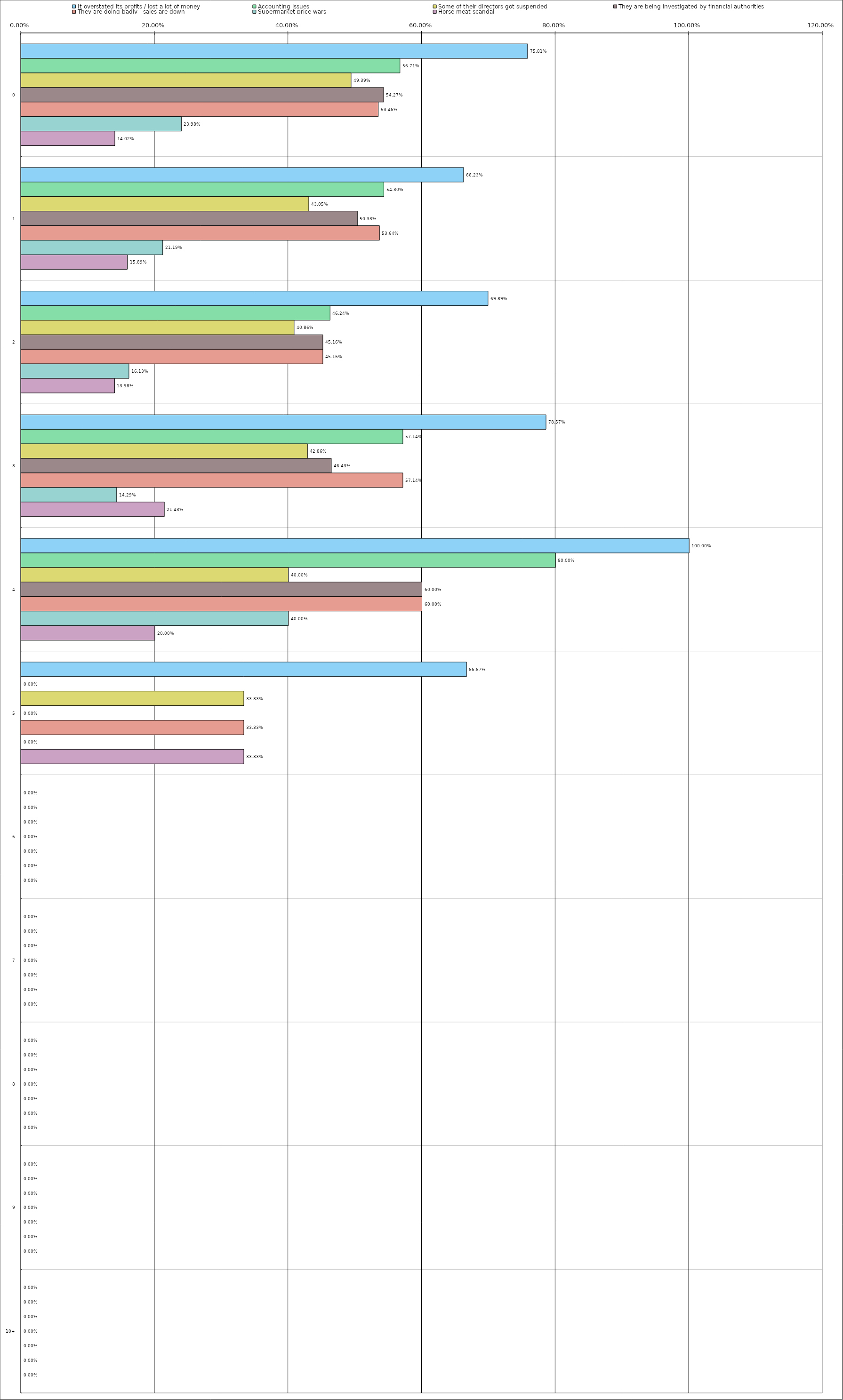
| Category | It overstated its profits / lost a lot of money | Accounting issues | Some of their directors got suspended | They are being investigated by financial authorities | They are doing badly - sales are down | Supermarket price wars | Horse-meat scandal |
|---|---|---|---|---|---|---|---|
| 0 | 0.758 | 0.567 | 0.494 | 0.543 | 0.535 | 0.24 | 0.14 |
| 1 | 0.662 | 0.543 | 0.43 | 0.503 | 0.536 | 0.212 | 0.159 |
| 2 | 0.699 | 0.462 | 0.409 | 0.452 | 0.452 | 0.161 | 0.14 |
| 3 | 0.786 | 0.571 | 0.429 | 0.464 | 0.571 | 0.143 | 0.214 |
| 4 | 1 | 0.8 | 0.4 | 0.6 | 0.6 | 0.4 | 0.2 |
| 5 | 0.667 | 0 | 0.333 | 0 | 0.333 | 0 | 0.333 |
| 6 | 0 | 0 | 0 | 0 | 0 | 0 | 0 |
| 7 | 0 | 0 | 0 | 0 | 0 | 0 | 0 |
| 8 | 0 | 0 | 0 | 0 | 0 | 0 | 0 |
| 9 | 0 | 0 | 0 | 0 | 0 | 0 | 0 |
| 10 | 0 | 0 | 0 | 0 | 0 | 0 | 0 |